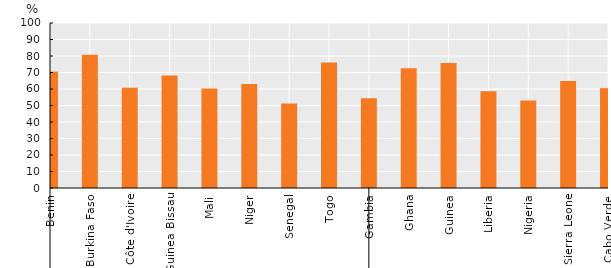
| Category | Series 0 |
|---|---|
| 0 | 70.517 |
| 1 | 80.8 |
| 2 | 60.75 |
| 3 | 68.117 |
| 4 | 60.267 |
| 5 | 63.05 |
| 6 | 51.267 |
| 7 | 76 |
| 8 | 54.333 |
| 9 | 72.633 |
| 10 | 75.833 |
| 11 | 58.667 |
| 12 | 53.05 |
| 13 | 64.9 |
| 14 | 60.517 |